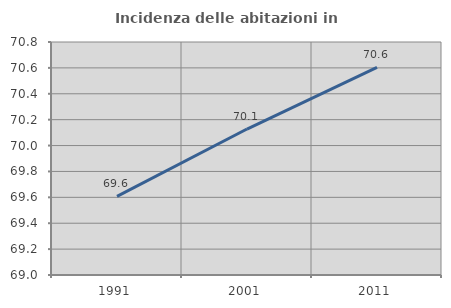
| Category | Incidenza delle abitazioni in proprietà  |
|---|---|
| 1991.0 | 69.607 |
| 2001.0 | 70.128 |
| 2011.0 | 70.604 |